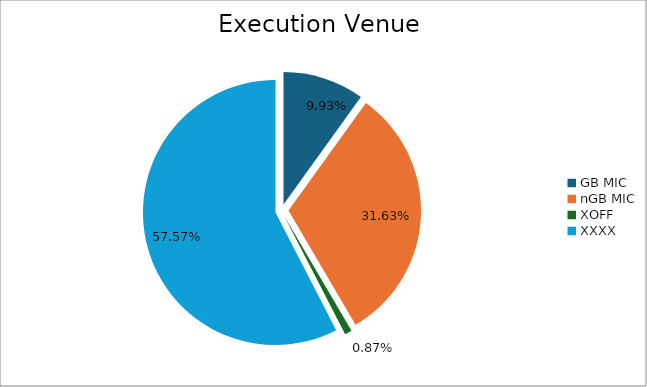
| Category | Series 0 |
|---|---|
| GB MIC | 1133869.637 |
| nGB MIC | 3613994.258 |
| XOFF | 99614.331 |
| XXXX | 6576753.564 |